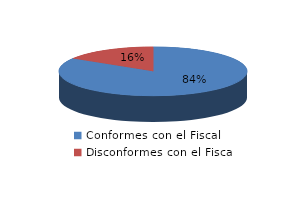
| Category | Series 0 |
|---|---|
| 0 | 57 |
| 1 | 11 |